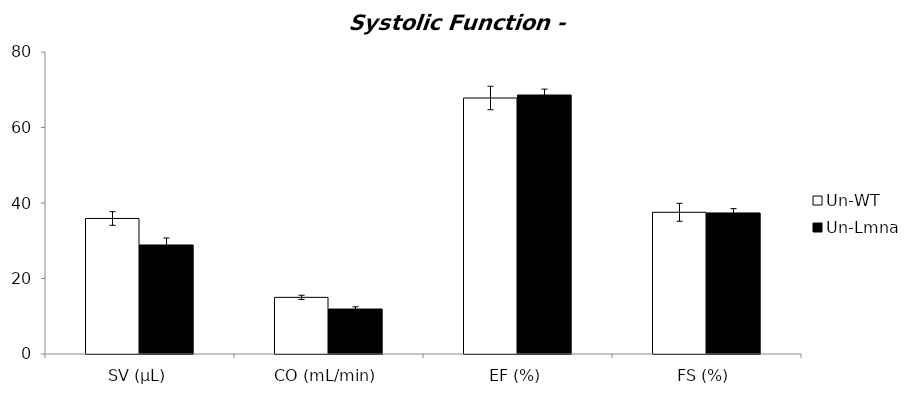
| Category | Un-WT | Un-Lmna |
|---|---|---|
| SV (μL) | 35.9 | 28.881 |
| CO (mL/min) | 15.005 | 11.912 |
| EF (%) | 67.812 | 68.606 |
| FS (%) | 37.538 | 37.365 |